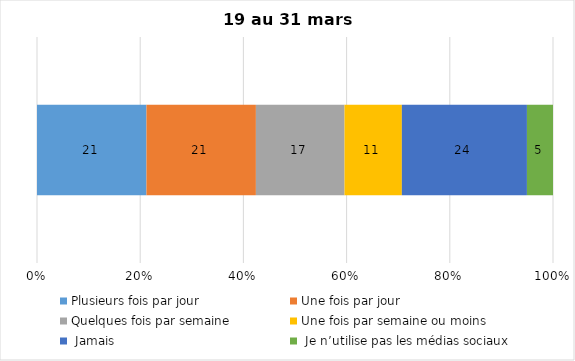
| Category | Plusieurs fois par jour | Une fois par jour | Quelques fois par semaine   | Une fois par semaine ou moins   |  Jamais   |  Je n’utilise pas les médias sociaux |
|---|---|---|---|---|---|---|
| 0 | 21 | 21 | 17 | 11 | 24 | 5 |